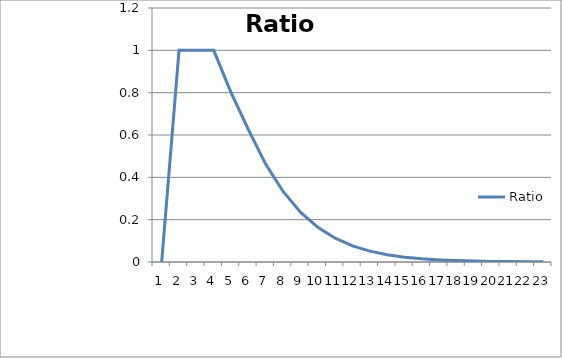
| Category | Ratio |
|---|---|
| 0 | 0 |
| 1 | 1 |
| 2 | 1 |
| 3 | 1 |
| 4 | 0.8 |
| 5 | 0.625 |
| 6 | 0.462 |
| 7 | 0.333 |
| 8 | 0.235 |
| 9 | 0.164 |
| 10 | 0.112 |
| 11 | 0.076 |
| 12 | 0.052 |
| 13 | 0.034 |
| 14 | 0.023 |
| 15 | 0.015 |
| 16 | 0.01 |
| 17 | 0.007 |
| 18 | 0.004 |
| 19 | 0.003 |
| 20 | 0.002 |
| 21 | 0.001 |
| 22 | 0.001 |